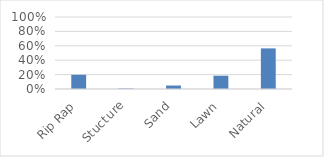
| Category | Series 0 |
|---|---|
| Rip Rap | 0.197 |
| Stucture | 0.007 |
| Sand | 0.048 |
| Lawn | 0.185 |
| Natural | 0.564 |